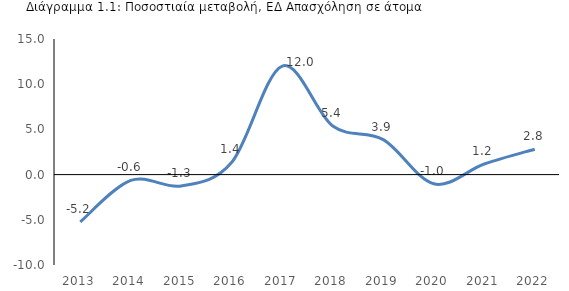
| Category | Απασχόληση, ΕΔ (άτομα, Στατιστική Υπηρεσία) % |
|---|---|
| 2013.0 | -5.23 |
| 2014.0 | -0.64 |
| 2015.0 | -1.251 |
| 2016.0 | 1.356 |
| 2017.0 | 12.007 |
| 2018.0 | 5.376 |
| 2019.0 | 3.873 |
| 2020.0 | -1.018 |
| 2021.0 | 1.17 |
| 2022.0 | 2.81 |